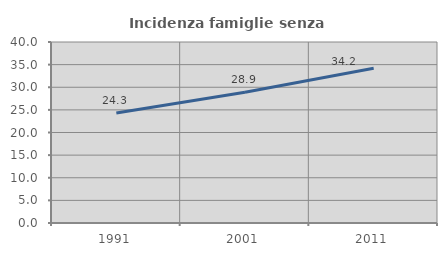
| Category | Incidenza famiglie senza nuclei |
|---|---|
| 1991.0 | 24.325 |
| 2001.0 | 28.917 |
| 2011.0 | 34.184 |